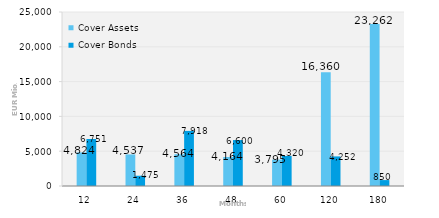
| Category | Cover Assets | Cover Bonds |
|---|---|---|
| 12.0 | 4824.476 | 6750.5 |
| 24.0 | 4536.578 | 1475 |
| 36.0 | 4563.834 | 7917.592 |
| 48.0 | 4163.602 | 6600 |
| 60.0 | 3795.37 | 4320 |
| 120.0 | 16360.066 | 4252.088 |
| 180.0 | 23261.501 | 850 |